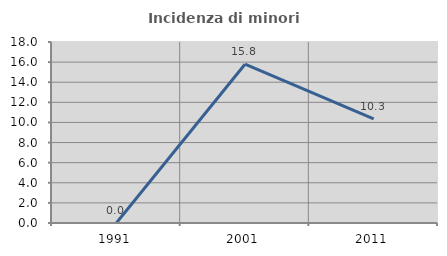
| Category | Incidenza di minori stranieri |
|---|---|
| 1991.0 | 0 |
| 2001.0 | 15.789 |
| 2011.0 | 10.345 |